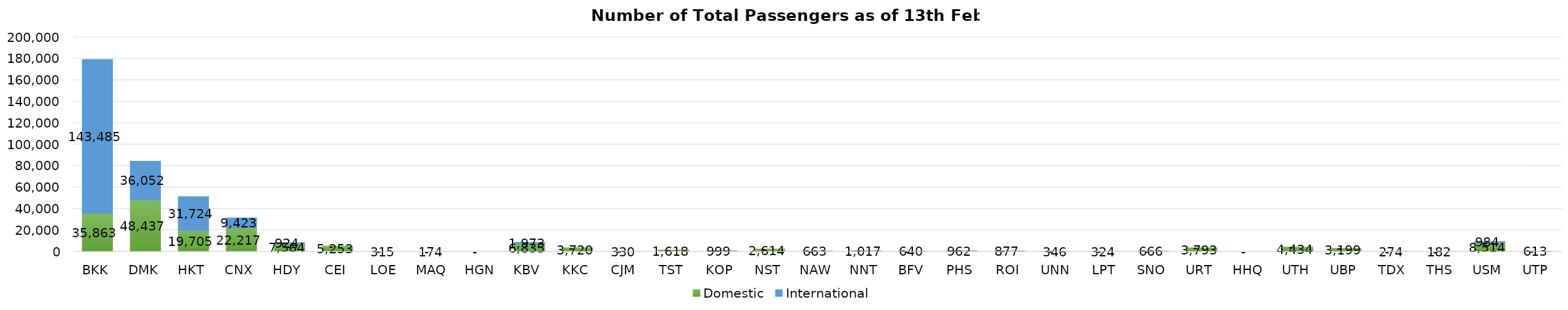
| Category | Domestic | International |
|---|---|---|
| BKK | 35863 | 143485 |
| DMK | 48437 | 36052 |
| HKT | 19705 | 31724 |
| CNX | 22217 | 9423 |
| HDY | 7564 | 924 |
| CEI | 5253 | 0 |
| LOE | 315 | 0 |
| MAQ | 174 | 0 |
| HGN | 0 | 0 |
| KBV | 6835 | 1973 |
| KKC | 3720 | 0 |
| CJM | 330 | 0 |
| TST | 1618 | 0 |
| KOP | 999 | 0 |
| NST | 2614 | 0 |
| NAW | 663 | 0 |
| NNT | 1017 | 0 |
| BFV | 640 | 0 |
| PHS | 962 | 0 |
| ROI | 877 | 0 |
| UNN | 346 | 0 |
| LPT | 324 | 0 |
| SNO | 666 | 0 |
| URT | 3793 | 0 |
| HHQ | 0 | 0 |
| UTH | 4434 | 0 |
| UBP | 3199 | 0 |
| TDX | 274 | 0 |
| THS | 182 | 0 |
| USM | 8514 | 984 |
| UTP | 613 | 0 |